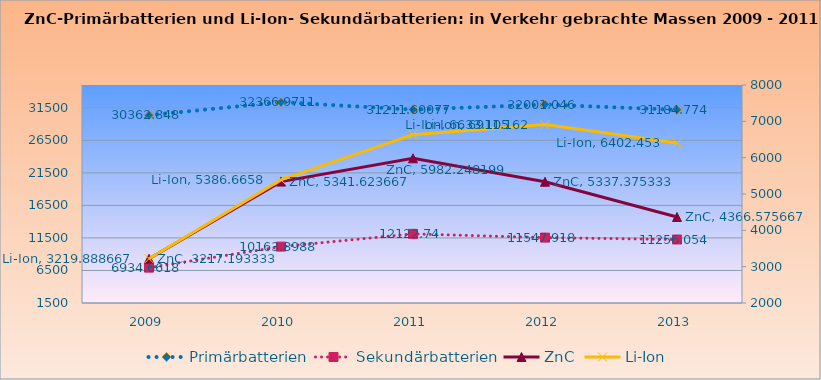
| Category | Primärbatterien | Sekundärbatterien |
|---|---|---|
| 2009.0 | 30362.848 | 6934.662 |
| 2010.0 | 32366.971 | 10163.899 |
| 2011.0 | 31211.601 | 12122.74 |
| 2012.0 | 32001.046 | 11547.918 |
| 2013.0 | 31184.774 | 11256.054 |